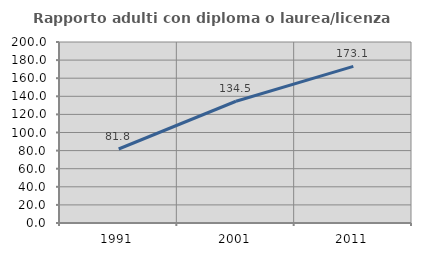
| Category | Rapporto adulti con diploma o laurea/licenza media  |
|---|---|
| 1991.0 | 81.757 |
| 2001.0 | 134.545 |
| 2011.0 | 173.101 |